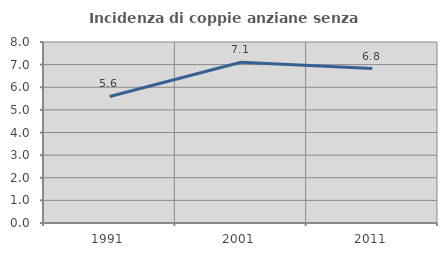
| Category | Incidenza di coppie anziane senza figli  |
|---|---|
| 1991.0 | 5.593 |
| 2001.0 | 7.102 |
| 2011.0 | 6.824 |